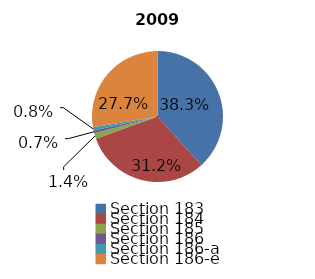
| Category | Series 0 |
|---|---|
| Section 183 | 1228 |
| Section 184 | 998 |
| Section 185 | 45 |
| Section 186 | 23 |
| Section 186-a | 24 |
| Section 186-e | 886 |